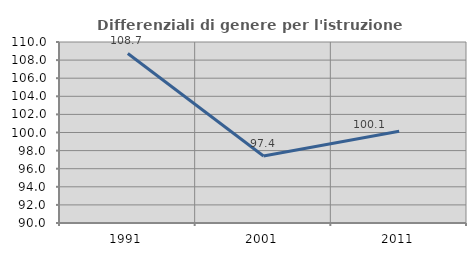
| Category | Differenziali di genere per l'istruzione superiore |
|---|---|
| 1991.0 | 108.736 |
| 2001.0 | 97.408 |
| 2011.0 | 100.131 |